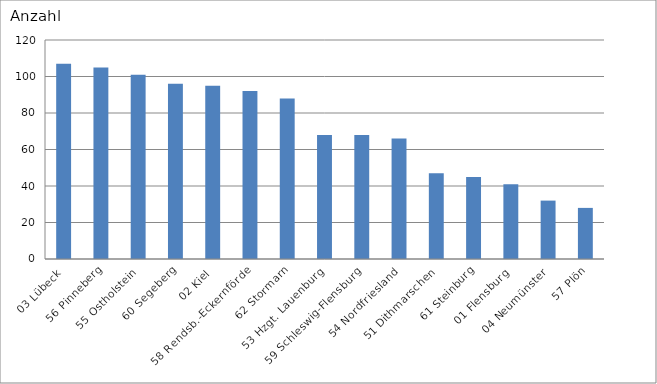
| Category | 03 Lübeck 56 Pinneberg 55 Ostholstein 60 Segeberg 02 Kiel 58 Rendsb.-Eckernförde 62 Stormarn 53 Hzgt. Lauenburg 59 Schleswig-Flensburg 54 Nordfriesland 51 Dithmarschen 61 Steinburg 01 Flensburg 04 Neumünster 57 Plön |
|---|---|
| 03 Lübeck | 107 |
| 56 Pinneberg | 105 |
| 55 Ostholstein | 101 |
| 60 Segeberg | 96 |
| 02 Kiel | 95 |
| 58 Rendsb.-Eckernförde | 92 |
| 62 Stormarn | 88 |
| 53 Hzgt. Lauenburg | 68 |
| 59 Schleswig-Flensburg | 68 |
| 54 Nordfriesland | 66 |
| 51 Dithmarschen | 47 |
| 61 Steinburg | 45 |
| 01 Flensburg | 41 |
| 04 Neumünster | 32 |
| 57 Plön | 28 |